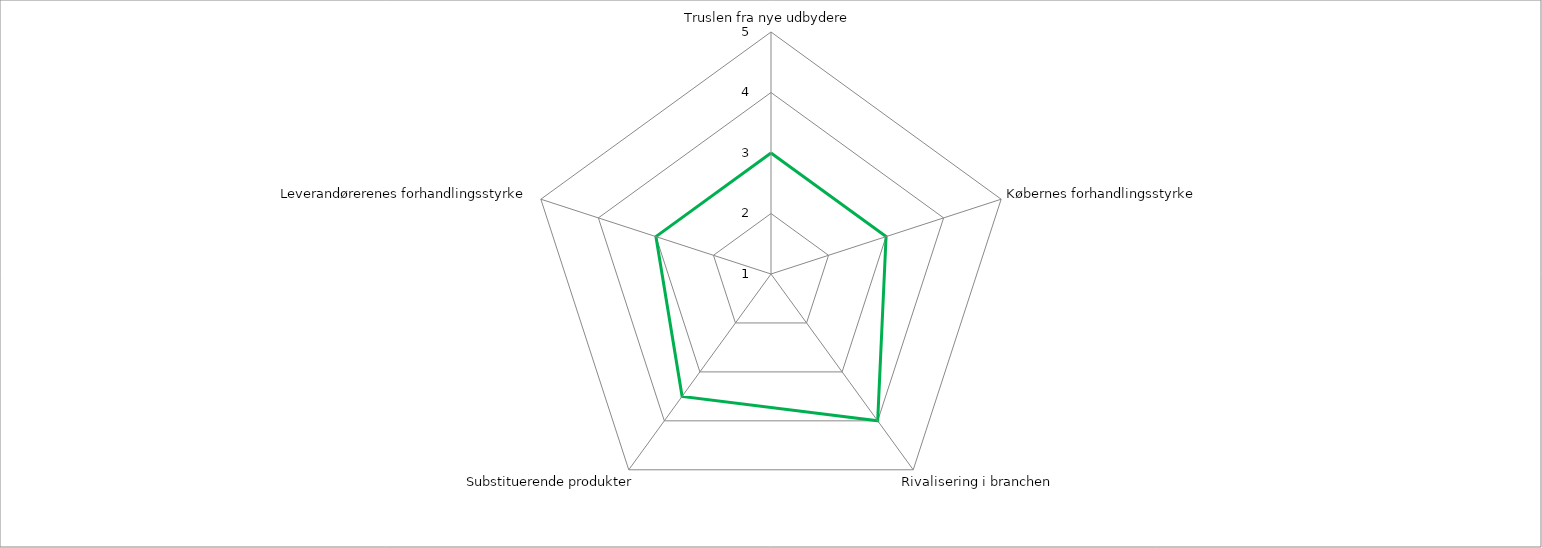
| Category | Series 0 |
|---|---|
| Truslen fra nye udbydere | 3 |
| Købernes forhandlingsstyrke | 3 |
| Rivalisering i branchen | 4 |
| Substituerende produkter | 3.5 |
| Leverandørerenes forhandlingsstyrke | 3 |